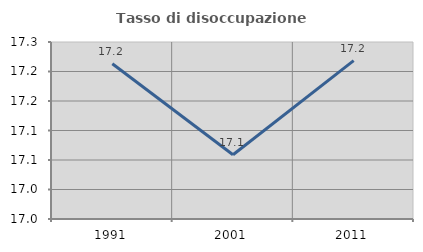
| Category | Tasso di disoccupazione giovanile  |
|---|---|
| 1991.0 | 17.213 |
| 2001.0 | 17.059 |
| 2011.0 | 17.219 |